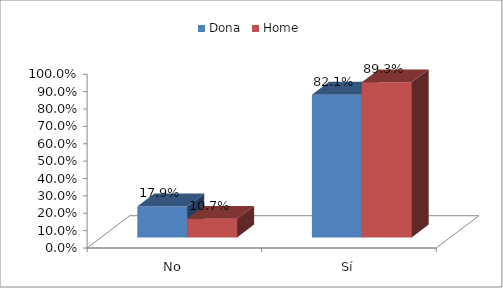
| Category | Dona | Home |
|---|---|---|
| No | 0.179 | 0.107 |
| Sí | 0.821 | 0.893 |